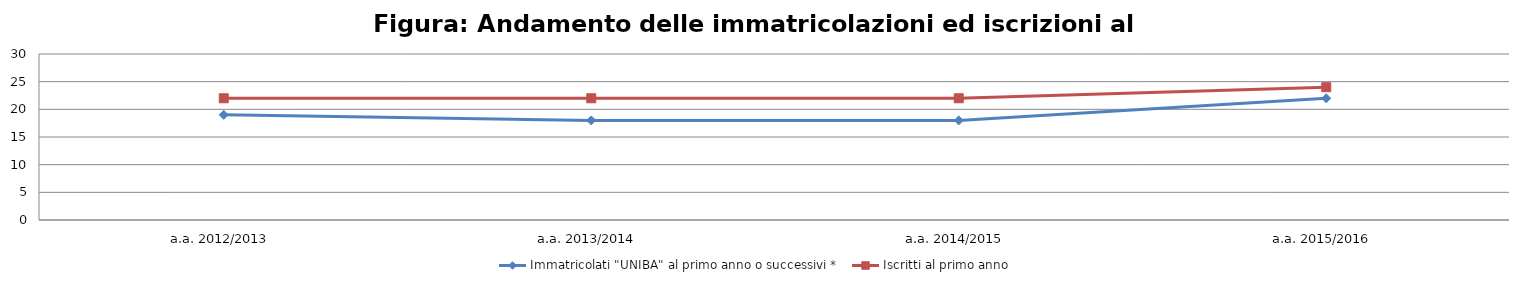
| Category | Immatricolati "UNIBA" al primo anno o successivi * | Iscritti al primo anno  |
|---|---|---|
| a.a. 2012/2013 | 19 | 22 |
| a.a. 2013/2014 | 18 | 22 |
| a.a. 2014/2015 | 18 | 22 |
| a.a. 2015/2016 | 22 | 24 |